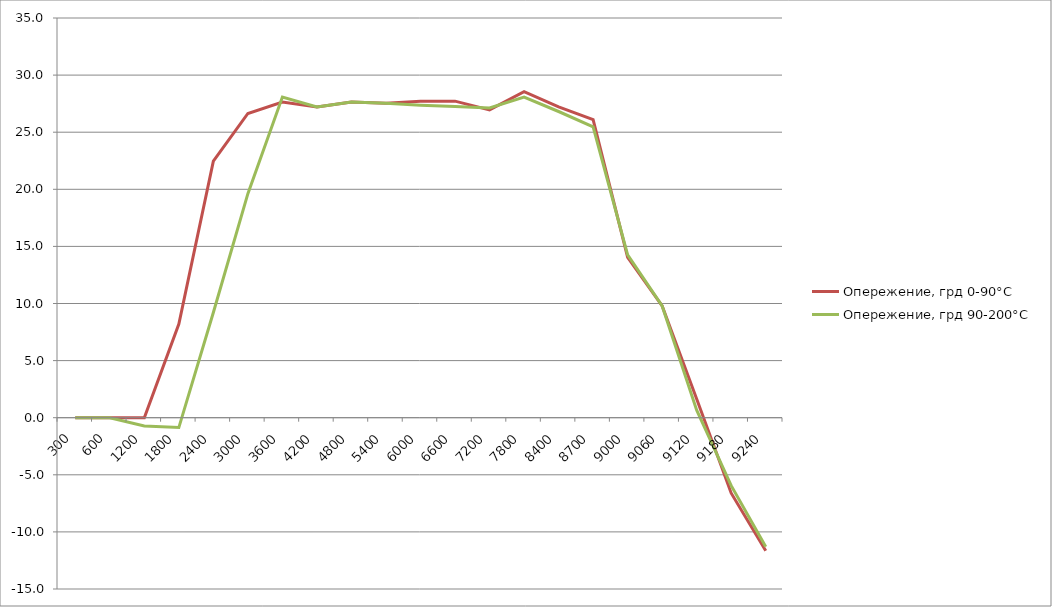
| Category | Опережение, грд 0-90°С | Опережение, грд 90-200°С |
|---|---|---|
| 300.0 | 0 | 0 |
| 600.0 | 0 | 0 |
| 1200.0 | 0 | -0.72 |
| 1800.0 | 8.208 | -0.864 |
| 2400.0 | 22.464 | 9.216 |
| 3000.0 | 26.64 | 19.62 |
| 3600.0 | 27.648 | 28.08 |
| 4200.0 | 27.216 | 27.216 |
| 4800.0 | 27.648 | 27.648 |
| 5400.0 | 27.54 | 27.54 |
| 6000.0 | 27.72 | 27.36 |
| 6600.0 | 27.72 | 27.245 |
| 7200.0 | 26.957 | 27.13 |
| 7800.0 | 28.548 | 28.08 |
| 8400.0 | 27.216 | 26.813 |
| 8700.0 | 26.1 | 25.474 |
| 9000.0 | 14.04 | 14.256 |
| 9060.0 | 9.785 | 9.785 |
| 9120.0 | 1.642 | 0.657 |
| 9180.0 | -6.61 | -5.949 |
| 9240.0 | -11.642 | -11.31 |